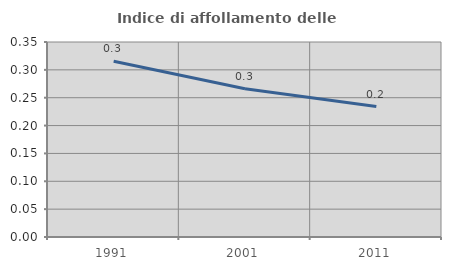
| Category | Indice di affollamento delle abitazioni  |
|---|---|
| 1991.0 | 0.315 |
| 2001.0 | 0.266 |
| 2011.0 | 0.234 |